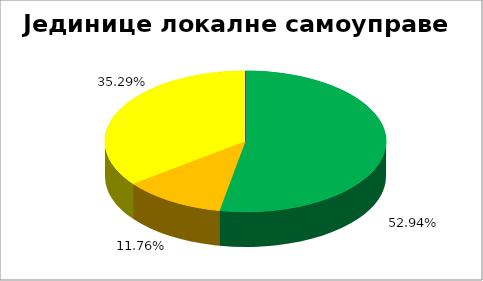
| Category | Jединице локалне самоуправе |
|---|---|
| 0 | 0.529 |
| 1 | 0.118 |
| 2 | 0.353 |
| 3 | 0 |
| 4 | 0 |